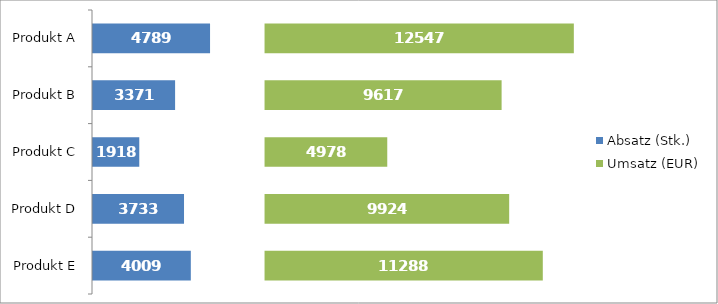
| Category | Absatz (Stk.) | Lücke | Umsatz (EUR) |
|---|---|---|---|
| Produkt A | 4789 | 2211 | 12547 |
| Produkt B | 3371 | 3629 | 9617 |
| Produkt C | 1918 | 5082 | 4978 |
| Produkt D | 3733 | 3267 | 9924 |
| Produkt E | 4009 | 2991 | 11288 |